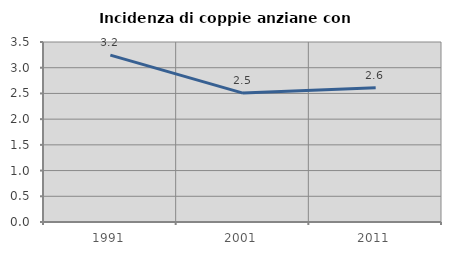
| Category | Incidenza di coppie anziane con figli |
|---|---|
| 1991.0 | 3.246 |
| 2001.0 | 2.506 |
| 2011.0 | 2.611 |